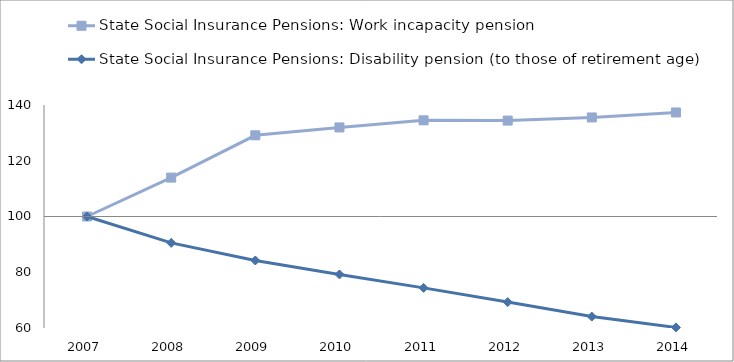
| Category | State Social Insurance Pensions: Work incapacity pension | State Social Insurance Pensions: Disability pension (to those of retirement age) | 0 |
|---|---|---|---|
| 2007.0 | 100 | 100 |  |
| 2008.0 | 113.949 | 90.538 |  |
| 2009.0 | 129.123 | 84.23 |  |
| 2010.0 | 131.951 | 79.221 |  |
| 2011.0 | 134.496 | 74.397 |  |
| 2012.0 | 134.402 | 69.295 |  |
| 2013.0 | 135.533 | 64.1 |  |
| 2014.0 | 137.323 | 60.204 |  |